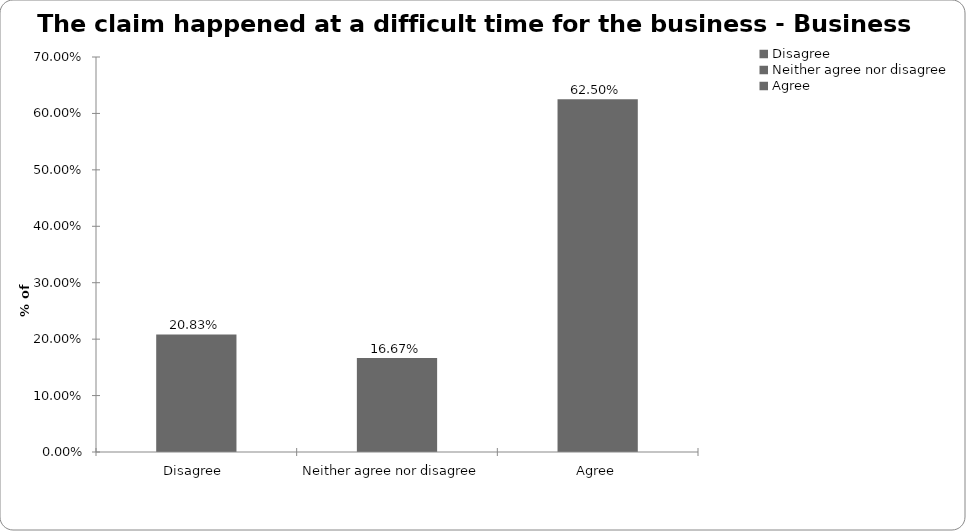
| Category | Business Interruption |
|---|---|
| Disagree  | 0.208 |
| Neither agree nor disagree  | 0.167 |
| Agree | 0.625 |